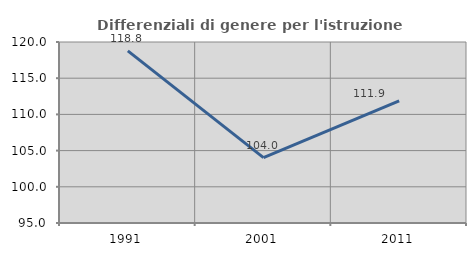
| Category | Differenziali di genere per l'istruzione superiore |
|---|---|
| 1991.0 | 118.774 |
| 2001.0 | 104.025 |
| 2011.0 | 111.861 |